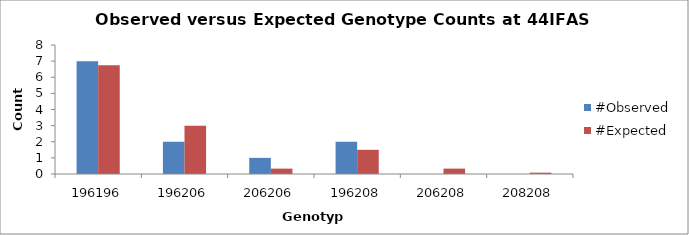
| Category | #Observed | #Expected |
|---|---|---|
| 196196.0 | 7 | 6.75 |
| 196206.0 | 2 | 3 |
| 206206.0 | 1 | 0.333 |
| 196208.0 | 2 | 1.5 |
| 206208.0 | 0 | 0.333 |
| 208208.0 | 0 | 0.083 |